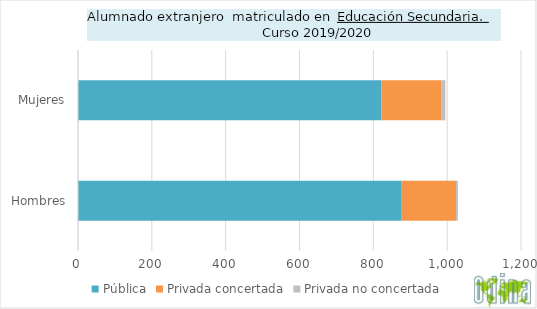
| Category | Pública | Privada concertada | Privada no concertada |
|---|---|---|---|
| Hombres | 875 | 149 | 5 |
| Mujeres | 822 | 163 | 10 |